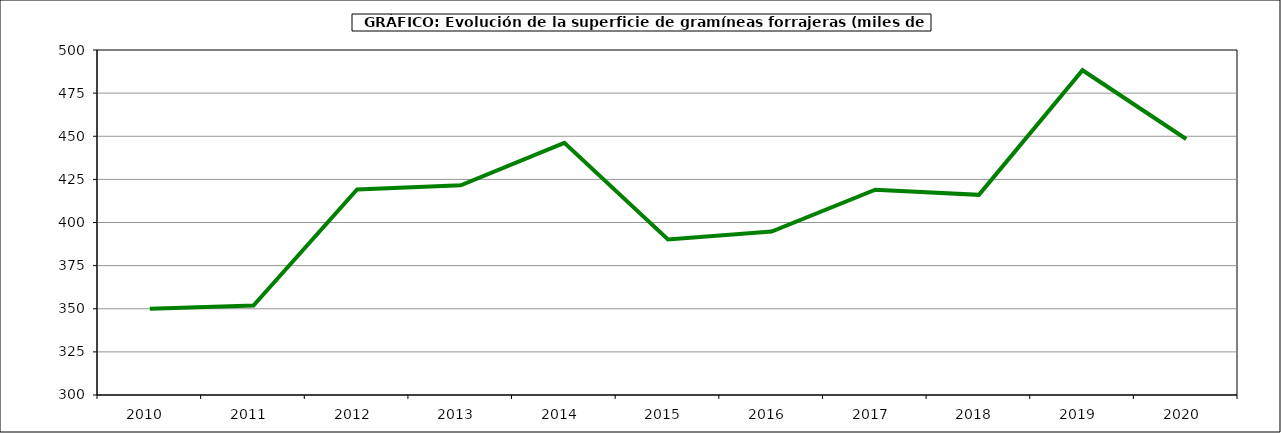
| Category | Superficie |
|---|---|
| 2010.0 | 350.058 |
| 2011.0 | 351.87 |
| 2012.0 | 419.197 |
| 2013.0 | 421.523 |
| 2014.0 | 446.163 |
| 2015.0 | 390.211 |
| 2016.0 | 394.792 |
| 2017.0 | 418.976 |
| 2018.0 | 416.034 |
| 2019.0 | 488.269 |
| 2020.0 | 448.392 |